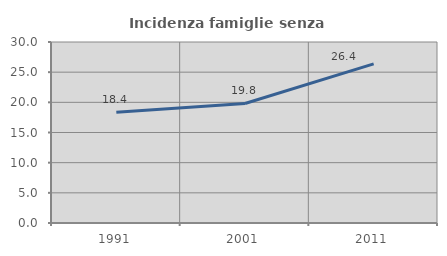
| Category | Incidenza famiglie senza nuclei |
|---|---|
| 1991.0 | 18.364 |
| 2001.0 | 19.81 |
| 2011.0 | 26.372 |